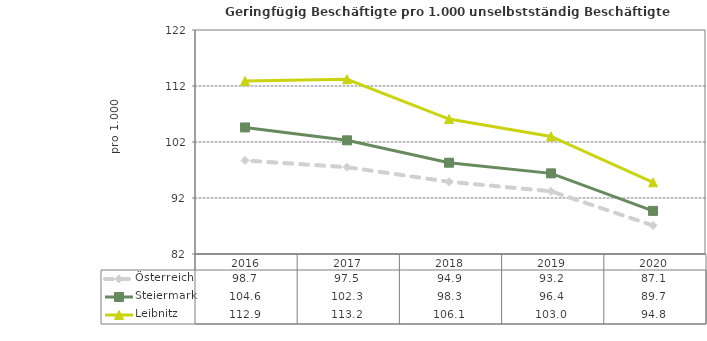
| Category | Österreich | Steiermark | Leibnitz |
|---|---|---|---|
| 2020.0 | 87.1 | 89.7 | 94.8 |
| 2019.0 | 93.2 | 96.4 | 103 |
| 2018.0 | 94.9 | 98.3 | 106.1 |
| 2017.0 | 97.5 | 102.3 | 113.2 |
| 2016.0 | 98.7 | 104.6 | 112.9 |